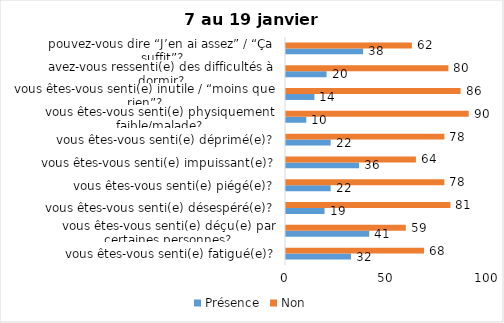
| Category | Présence | Non |
|---|---|---|
| vous êtes-vous senti(e) fatigué(e)? | 32 | 68 |
| vous êtes-vous senti(e) déçu(e) par certaines personnes? | 41 | 59 |
| vous êtes-vous senti(e) désespéré(e)? | 19 | 81 |
| vous êtes-vous senti(e) piégé(e)? | 22 | 78 |
| vous êtes-vous senti(e) impuissant(e)? | 36 | 64 |
| vous êtes-vous senti(e) déprimé(e)? | 22 | 78 |
| vous êtes-vous senti(e) physiquement faible/malade? | 10 | 90 |
| vous êtes-vous senti(e) inutile / “moins que rien”? | 14 | 86 |
| avez-vous ressenti(e) des difficultés à dormir? | 20 | 80 |
| pouvez-vous dire “J’en ai assez” / “Ça suffit”? | 38 | 62 |